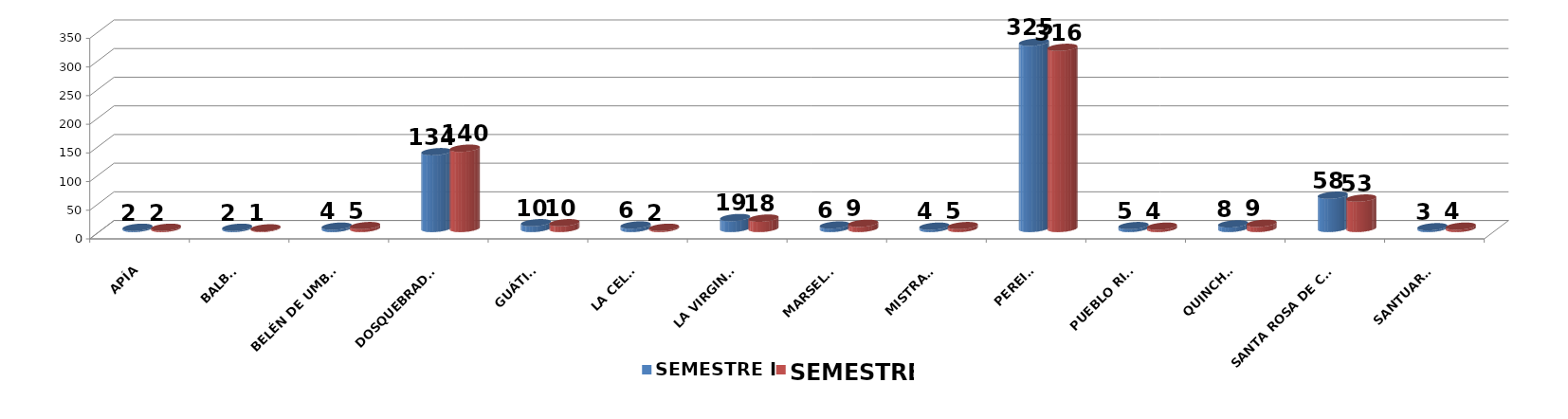
| Category | SEMESTRE I | SEMESTRE II |
|---|---|---|
| Apía | 2 | 2 |
| Balboa | 2 | 1 |
| Belén de Umbría | 4 | 5 |
| Dosquebradas | 134 | 140 |
| Guática | 10 | 10 |
| La Celia | 6 | 2 |
| La Virginia | 19 | 18 |
| Marsella | 6 | 9 |
| Mistrató | 4 | 5 |
| Pereira | 325 | 316 |
| Pueblo Rico | 5 | 4 |
| Quinchía | 8 | 9 |
| Santa Rosa de Cabal | 58 | 53 |
| Santuario | 3 | 4 |